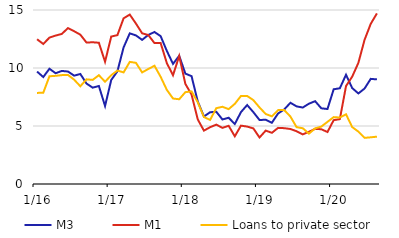
| Category | M3 | M1 | Loans to private sector |
|---|---|---|---|
|  1/16 | 9.691 | 12.477 | 7.853 |
| 2 | 9.221 | 12.071 | 7.865 |
| 3 | 9.937 | 12.619 | 9.286 |
| 4 | 9.548 | 12.796 | 9.325 |
| 5 | 9.747 | 12.937 | 9.385 |
| 6 | 9.696 | 13.442 | 9.403 |
| 7 | 9.341 | 13.169 | 8.992 |
| 8 | 9.484 | 12.872 | 8.426 |
| 9 | 8.659 | 12.193 | 9.022 |
| 10 | 8.307 | 12.218 | 8.975 |
| 11 | 8.449 | 12.177 | 9.38 |
| 12 | 6.723 | 10.54 | 8.816 |
|  1/17 | 8.966 | 12.711 | 9.379 |
| 2 | 9.714 | 12.834 | 9.781 |
| 3 | 11.775 | 14.282 | 9.62 |
| 4 | 12.987 | 14.606 | 10.528 |
| 5 | 12.808 | 13.83 | 10.445 |
| 6 | 12.425 | 12.993 | 9.619 |
| 7 | 12.849 | 12.842 | 9.914 |
| 8 | 13.105 | 12.147 | 10.193 |
| 9 | 12.743 | 12.148 | 9.238 |
| 10 | 11.473 | 10.419 | 8.113 |
| 11 | 10.355 | 9.377 | 7.368 |
| 12 | 11.047 | 11.032 | 7.305 |
|  1/18 | 9.516 | 8.626 | 7.918 |
| 2 | 9.298 | 7.714 | 7.983 |
| 3 | 7.121 | 5.573 | 7.051 |
| 4 | 5.819 | 4.602 | 5.78 |
| 5 | 6.185 | 4.894 | 5.522 |
| 6 | 6.228 | 5.118 | 6.536 |
| 7 | 5.561 | 4.84 | 6.657 |
| 8 | 5.712 | 5.02 | 6.454 |
| 9 | 5.172 | 4.113 | 6.908 |
| 10 | 6.2 | 5.031 | 7.59 |
| 11 | 6.807 | 4.95 | 7.588 |
| 12 | 6.195 | 4.794 | 7.229 |
|  1/19 | 5.516 | 4.009 | 6.6 |
| 2 | 5.54 | 4.604 | 6.035 |
| 3 | 5.275 | 4.413 | 5.835 |
| 4 | 6.075 | 4.839 | 6.369 |
| 5 | 6.427 | 4.813 | 6.374 |
| 6 | 7.002 | 4.742 | 5.815 |
| 7 | 6.692 | 4.549 | 4.899 |
| 8 | 6.591 | 4.278 | 4.808 |
| 9 | 6.924 | 4.5 | 4.343 |
| 10 | 7.14 | 4.758 | 4.797 |
| 11 | 6.526 | 4.72 | 4.948 |
| 12 | 6.463 | 4.481 | 5.357 |
|  1/20 | 8.164 | 5.503 | 5.765 |
| 2 | 8.253 | 5.59 | 5.73 |
| 3 | 9.419 | 8.44 | 6.009 |
| 4 | 8.269 | 9.253 | 4.908 |
| 5 | 7.806 | 10.444 | 4.516 |
| 6 | 8.229 | 12.427 | 3.978 |
| 7 | 9.064 | 13.806 | 4.025 |
| 8 | 9.018 | 14.706 | 4.081 |